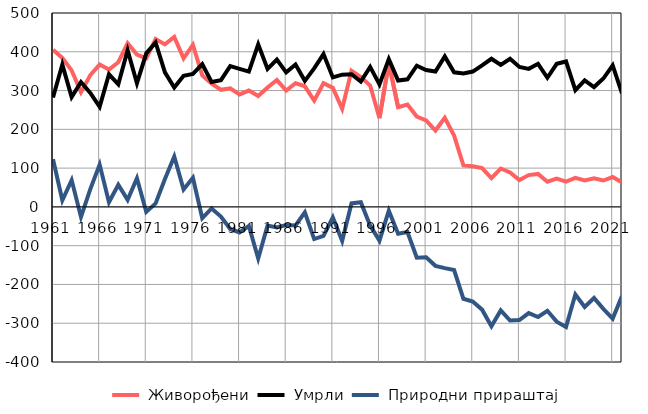
| Category |  Живорођени |  Умрли |  Природни прираштај |
|---|---|---|---|
| 1961.0 | 405 | 282 | 123 |
| 1962.0 | 384 | 367 | 17 |
| 1963.0 | 352 | 283 | 69 |
| 1964.0 | 296 | 322 | -26 |
| 1965.0 | 340 | 294 | 46 |
| 1966.0 | 367 | 258 | 109 |
| 1967.0 | 354 | 342 | 12 |
| 1968.0 | 373 | 316 | 57 |
| 1969.0 | 422 | 404 | 18 |
| 1970.0 | 393 | 319 | 74 |
| 1971.0 | 383 | 396 | -13 |
| 1972.0 | 433 | 424 | 9 |
| 1973.0 | 419 | 347 | 72 |
| 1974.0 | 438 | 308 | 130 |
| 1975.0 | 383 | 338 | 45 |
| 1976.0 | 418 | 343 | 75 |
| 1977.0 | 339 | 368 | -29 |
| 1978.0 | 318 | 322 | -4 |
| 1979.0 | 302 | 327 | -25 |
| 1980.0 | 306 | 363 | -57 |
| 1981.0 | 290 | 356 | -66 |
| 1982.0 | 300 | 349 | -49 |
| 1983.0 | 286 | 419 | -133 |
| 1984.0 | 308 | 356 | -48 |
| 1985.0 | 327 | 380 | -53 |
| 1986.0 | 300 | 347 | -47 |
| 1987.0 | 319 | 367 | -48 |
| 1988.0 | 311 | 325 | -14 |
| 1989.0 | 274 | 357 | -83 |
| 1990.0 | 319 | 394 | -75 |
| 1991.0 | 307 | 334 | -27 |
| 1992.0 | 253 | 341 | -88 |
| 1993.0 | 351 | 342 | 9 |
| 1994.0 | 335 | 323 | 12 |
| 1995.0 | 313 | 361 | -48 |
| 1996.0 | 229 | 316 | -87 |
| 1997.0 | 371 | 381 | -10 |
| 1998.0 | 257 | 326 | -69 |
| 1999.0 | 264 | 329 | -65 |
| 2000.0 | 233 | 364 | -131 |
| 2001.0 | 223 | 353 | -130 |
| 2002.0 | 197 | 349 | -152 |
| 2003.0 | 230 | 388 | -158 |
| 2004.0 | 184 | 347 | -163 |
| 2005.0 | 107 | 344 | -237 |
| 2006.0 | 105 | 349 | -244 |
| 2007.0 | 100 | 365 | -265 |
| 2008.0 | 74 | 382 | -308 |
| 2009.0 | 99 | 366 | -267 |
| 2010.0 | 89 | 382 | -293 |
| 2011.0 | 69 | 361 | -292 |
| 2012.0 | 82 | 356 | -274 |
| 2013.0 | 85 | 369 | -284 |
| 2014.0 | 65 | 333 | -268 |
| 2015.0 | 73 | 369 | -296 |
| 2016.0 | 65 | 375 | -310 |
| 2017.0 | 75 | 301 | -226 |
| 2018.0 | 68 | 326 | -258 |
| 2019.0 | 74 | 309 | -235 |
| 2020.0 | 68 | 331 | -263 |
| 2021.0 | 77 | 365 | -288 |
| 2022.0 | 63 | 293 | -230 |